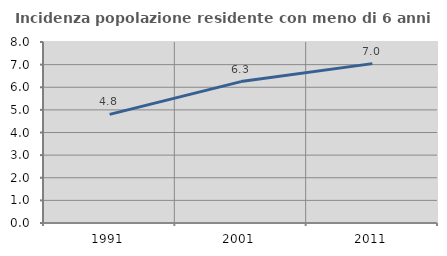
| Category | Incidenza popolazione residente con meno di 6 anni |
|---|---|
| 1991.0 | 4.8 |
| 2001.0 | 6.25 |
| 2011.0 | 7.045 |